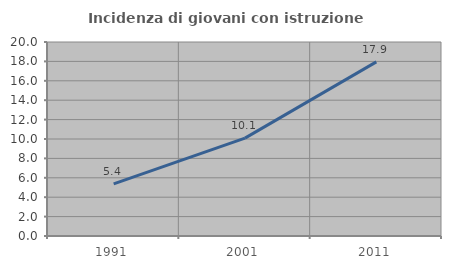
| Category | Incidenza di giovani con istruzione universitaria |
|---|---|
| 1991.0 | 5.376 |
| 2001.0 | 10.092 |
| 2011.0 | 17.949 |